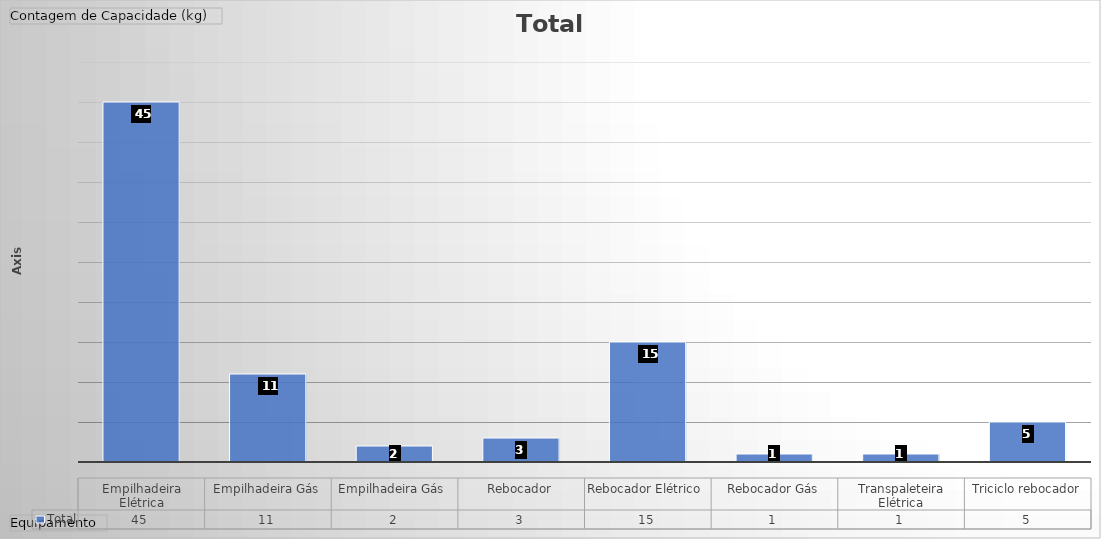
| Category | Total |
|---|---|
| Empilhadeira Elétrica | 45 |
| Empilhadeira Gás | 11 |
| Empilhadeira Gás  | 2 |
| Rebocador | 3 |
| Rebocador Elétrico  | 15 |
| Rebocador Gás | 1 |
| Transpaleteira Elétrica | 1 |
| Triciclo rebocador | 5 |